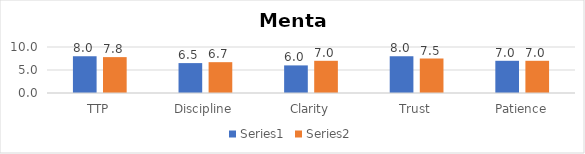
| Category | Series 0 | Series 1 |
|---|---|---|
| TTP | 8 | 7.8 |
| Discipline | 6.5 | 6.7 |
| Clarity | 6 | 7 |
| Trust | 8 | 7.5 |
| Patience | 7 | 7 |